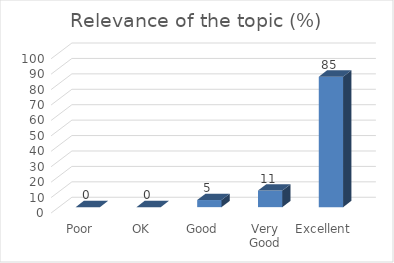
| Category | Relevance of the topic (%) |
|---|---|
| Poor | 0 |
| OK | 0 |
| Good | 4.61 |
| Very Good | 10.76 |
| Excellent | 84.6 |